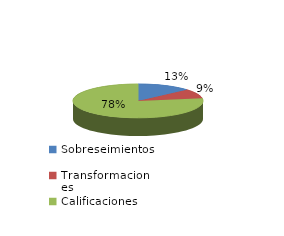
| Category | Series 0 |
|---|---|
| Sobreseimientos | 1136 |
| Transformaciones | 749 |
| Calificaciones | 6532 |